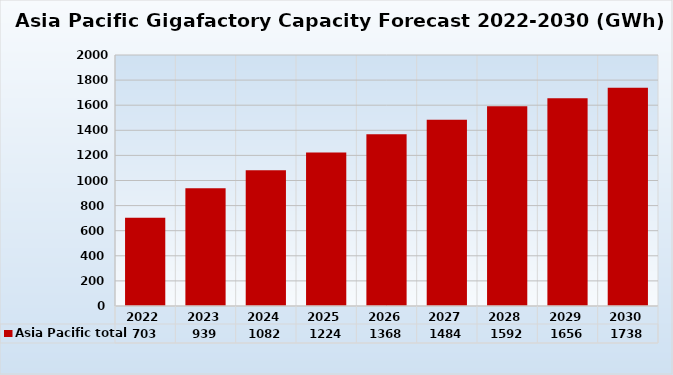
| Category | Asia Pacific total |
|---|---|
| 2022.0 | 703.33 |
| 2023.0 | 939.2 |
| 2024.0 | 1081.8 |
| 2025.0 | 1223.5 |
| 2026.0 | 1367.6 |
| 2027.0 | 1483.7 |
| 2028.0 | 1591.9 |
| 2029.0 | 1655.5 |
| 2030.0 | 1738.1 |